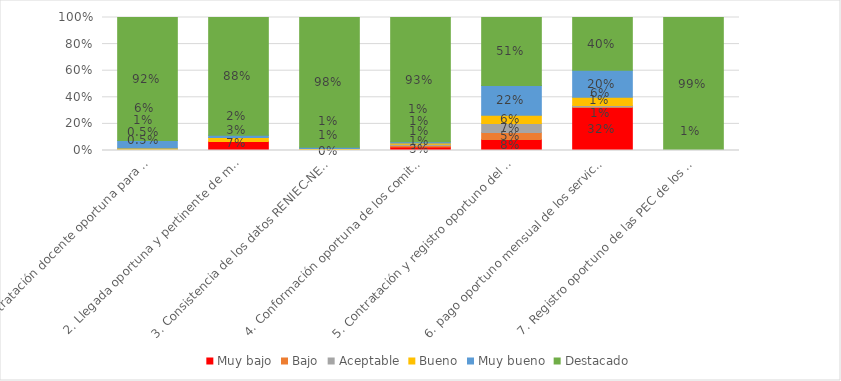
| Category | Muy bajo | Bajo | Aceptable | Bueno | Muy bueno | Destacado |
|---|---|---|---|---|---|---|
| 1. Contratación docente oportuna para el inicio del año escolar (DITEN)  | 0 | 0.005 | 0.005 | 0.009 | 0.057 | 0.924 |
| 2. Llegada oportuna y pertinente de materiales educativos a las II.EE, para el año escolar 2018 (UPP) | 0.068 | 0 | 0 | 0.029 | 0.018 | 0.885 |
| 3. Consistencia de los datos RENIEC-NEXUS-SUP (DITEN) | 0 | 0 | 0 | 0.014 | 0.009 | 0.976 |
| 4. Conformación oportuna de los comites de la evaluación ordinaria de Desempeño docente (DIED) | 0.026 | 0.012 | 0.01 | 0.01 | 0.01 | 0.933 |
| 5. Contratación y registro oportuno del personal CAS para las intervenciones prioritarias del sector educación (UPP) | 0.083 | 0.052 | 0.068 | 0.062 | 0.224 | 0.51 |
| 6. pago oportuno mensual de los servicios básicos de II.EE de EBR y EBE (UPP) | 0.323 | 0.005 | 0.01 | 0.062 | 0.203 | 0.396 |
| 7. Registro oportuno de las PEC de los PRONOEI (UPP) | 0 | 0 | 0 | 0 | 0.005 | 0.995 |